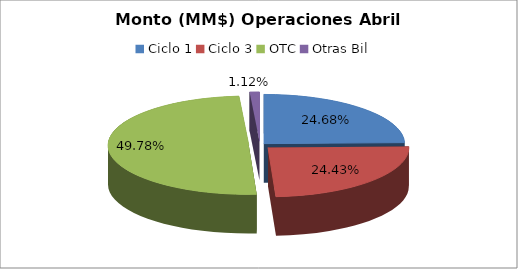
| Category | Series 0 |
|---|---|
| Ciclo 1 | 12596004.104 |
| Ciclo 3 | 12469067.566 |
| OTC | 25410275.768 |
| Otras Bil | 570340.218 |